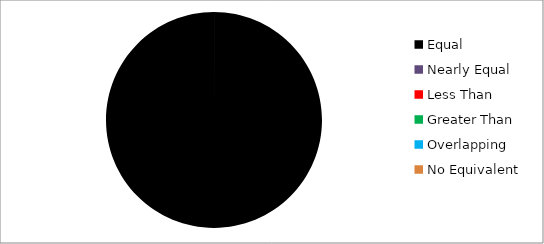
| Category | Series 0 |
|---|---|
| Equal | 6 |
| Nearly Equal | 0 |
| Less Than | 0 |
| Greater Than | 0 |
| Overlapping | 0 |
| No Equivalent | 0 |